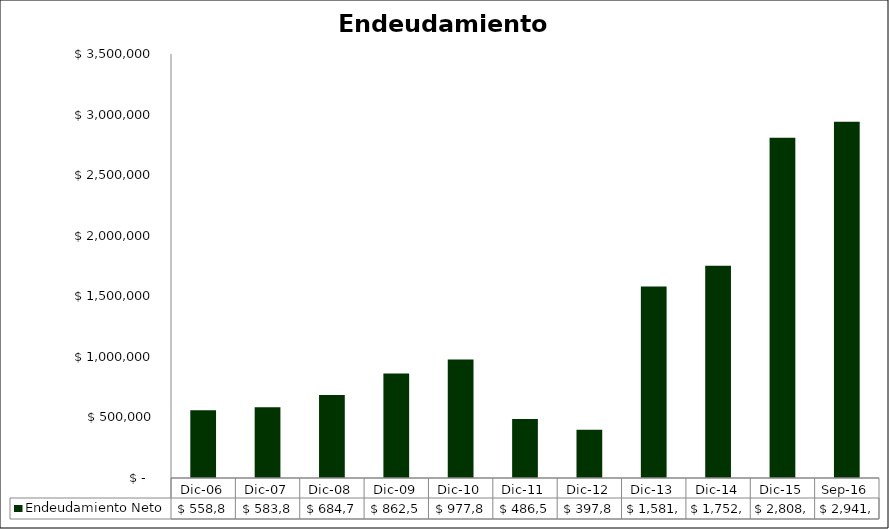
| Category | Endeudamiento Neto  |
|---|---|
| Dic-06 | 558856 |
| Dic-07 | 583844 |
| Dic-08 | 684783 |
| Dic-09 | 862585 |
| Dic-10 | 977827.862 |
| Dic-11 | 486511.217 |
| Dic-12 | 397862.444 |
| Dic-13 | 1581259.56 |
| Dic-14 | 1752414 |
| Dic-15 | 2808200.343 |
| Sep-16 | 2941161.626 |